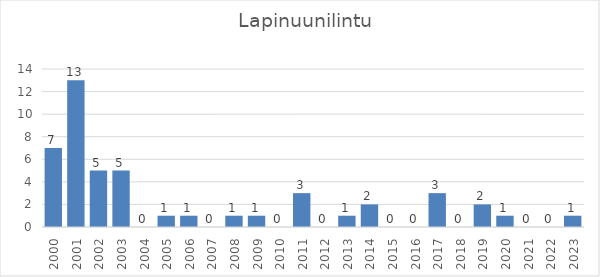
| Category | Series 0 |
|---|---|
| 2000.0 | 7 |
| 2001.0 | 13 |
| 2002.0 | 5 |
| 2003.0 | 5 |
| 2004.0 | 0 |
| 2005.0 | 1 |
| 2006.0 | 1 |
| 2007.0 | 0 |
| 2008.0 | 1 |
| 2009.0 | 1 |
| 2010.0 | 0 |
| 2011.0 | 3 |
| 2012.0 | 0 |
| 2013.0 | 1 |
| 2014.0 | 2 |
| 2015.0 | 0 |
| 2016.0 | 0 |
| 2017.0 | 3 |
| 2018.0 | 0 |
| 2019.0 | 2 |
| 2020.0 | 1 |
| 2021.0 | 0 |
| 2022.0 | 0 |
| 2023.0 | 1 |